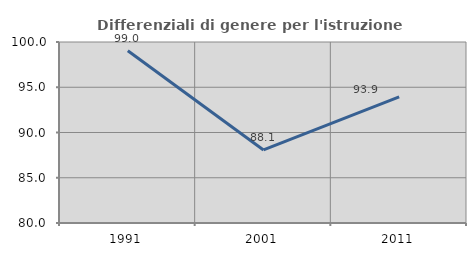
| Category | Differenziali di genere per l'istruzione superiore |
|---|---|
| 1991.0 | 99.042 |
| 2001.0 | 88.069 |
| 2011.0 | 93.945 |